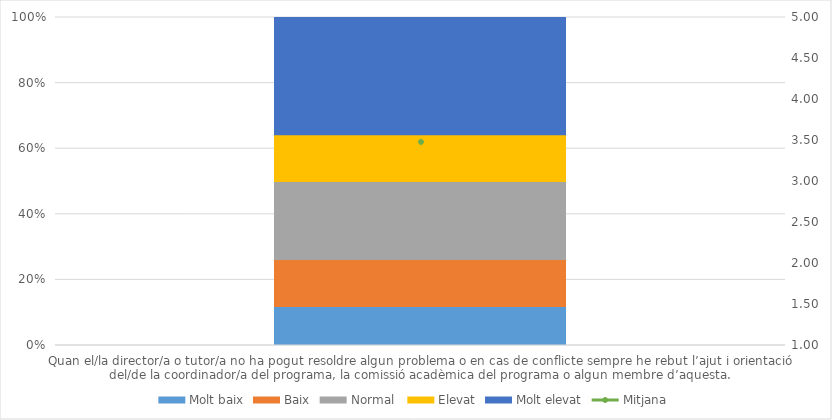
| Category | Molt baix | Baix | Normal  | Elevat | Molt elevat |
|---|---|---|---|---|---|
| Quan el/la director/a o tutor/a no ha pogut resoldre algun problema o en cas de conflicte sempre he rebut l’ajut i orientació del/de la coordinador/a del programa, la comissió acadèmica del programa o algun membre d’aquesta. | 5 | 6 | 10 | 6 | 15 |